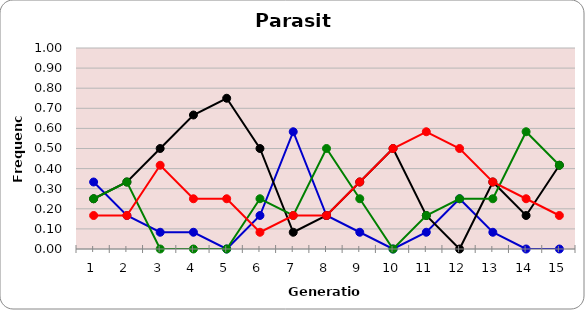
| Category | Sp | Cl | Di | He |
|---|---|---|---|---|
| 1.0 | 0.333 | 0.25 | 0.25 | 0.167 |
| 2.0 | 0.167 | 0.333 | 0.333 | 0.167 |
| 3.0 | 0.083 | 0.5 | 0 | 0.417 |
| 4.0 | 0.083 | 0.667 | 0 | 0.25 |
| 5.0 | 0 | 0.75 | 0 | 0.25 |
| 6.0 | 0.167 | 0.5 | 0.25 | 0.083 |
| 7.0 | 0.583 | 0.083 | 0.167 | 0.167 |
| 8.0 | 0.167 | 0.167 | 0.5 | 0.167 |
| 9.0 | 0.083 | 0.333 | 0.25 | 0.333 |
| 10.0 | 0 | 0.5 | 0 | 0.5 |
| 11.0 | 0.083 | 0.167 | 0.167 | 0.583 |
| 12.0 | 0.25 | 0 | 0.25 | 0.5 |
| 13.0 | 0.083 | 0.333 | 0.25 | 0.333 |
| 14.0 | 0 | 0.167 | 0.583 | 0.25 |
| 15.0 | 0 | 0.417 | 0.417 | 0.167 |